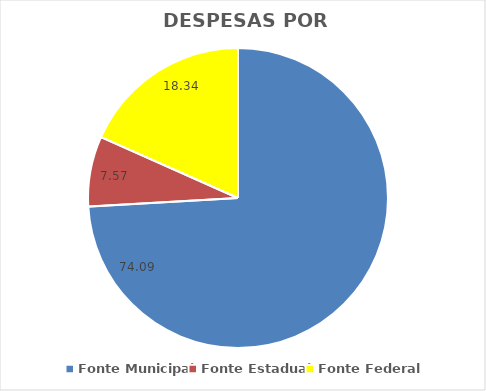
| Category | % |
|---|---|
| Fonte Municipal | 74.09 |
| Fonte Estadual | 7.57 |
| Fonte Federal | 18.34 |